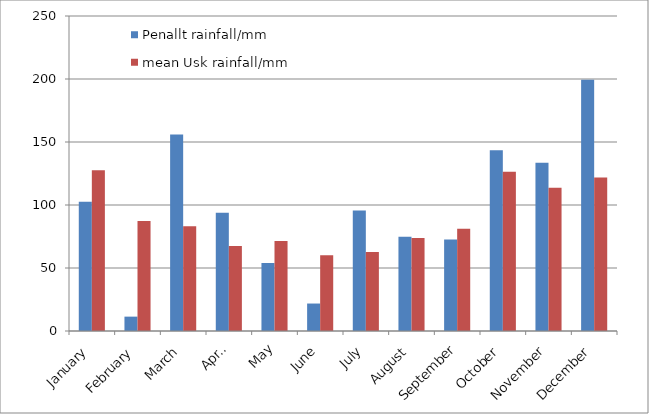
| Category | Penallt rainfall/mm | mean Usk rainfall/mm |
|---|---|---|
| January | 102.6 | 127.6 |
| February | 11.4 | 87.4 |
| March | 156 | 83.1 |
| April | 93.8 | 67.5 |
| May | 54 | 71.5 |
| June | 21.8 | 60.2 |
| July | 95.6 | 62.6 |
| August | 74.8 | 73.9 |
| September | 72.6 | 81.2 |
| October | 143.4 | 126.3 |
| November | 133.6 | 113.7 |
| December | 199.4 | 121.9 |